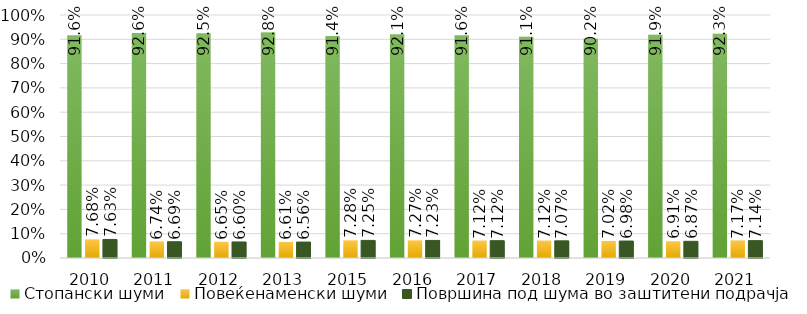
| Category | Стопански шуми | Повеќенаменски шуми | Површина под шума во заштитени подрачја |
|---|---|---|---|
| 2010.0 | 0.916 | 0.077 | 0.076 |
| 2011.0 | 0.926 | 0.067 | 0.067 |
| 2012.0 | 0.925 | 0.066 | 0.066 |
| 2013.0 | 0.928 | 0.066 | 0.066 |
| 2015.0 | 0.914 | 0.073 | 0.072 |
| 2016.0 | 0.921 | 0.073 | 0.072 |
| 2017.0 | 0.916 | 0.071 | 0.071 |
| 2018.0 | 0.911 | 0.071 | 0.071 |
| 2019.0 | 0.902 | 0.07 | 0.07 |
| 2020.0 | 0.919 | 0.069 | 0.069 |
| 2021.0 | 0.923 | 0.072 | 0.071 |